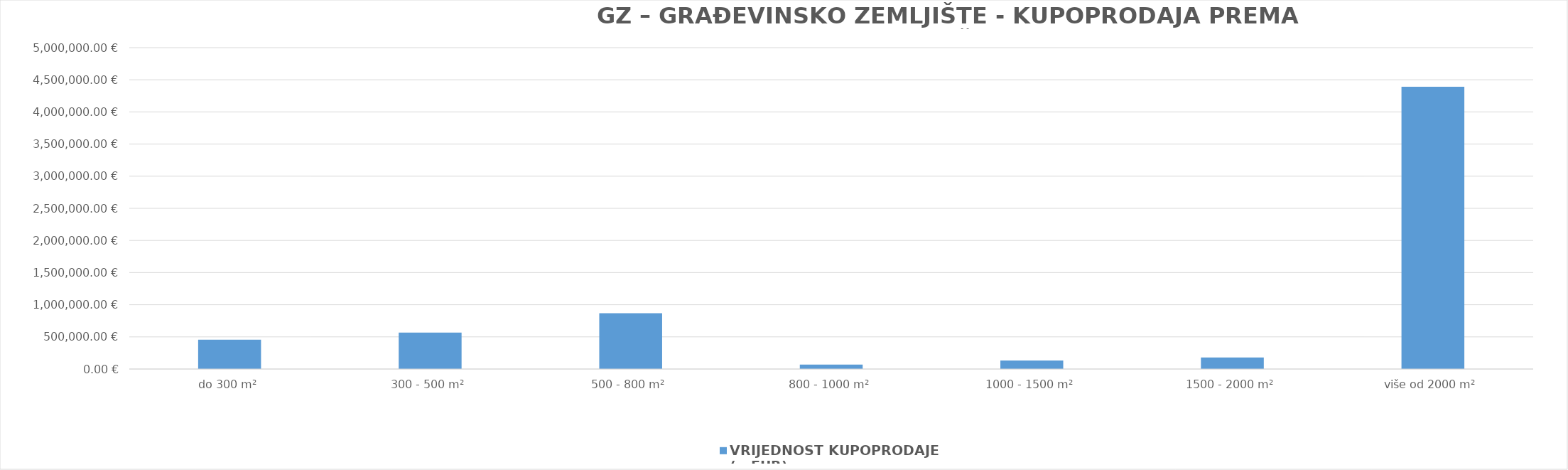
| Category | VRIJEDNOST KUPOPRODAJE (u EUR) |
|---|---|
| do 300 m² | 455066.73 |
| 300 - 500 m² | 567082.642 |
| 500 - 800 m² | 867393.257 |
| 800 - 1000 m² | 69775.542 |
| 1000 - 1500 m² | 132580.578 |
| 1500 - 2000 m² | 179267.529 |
| više od 2000 m² | 4392774.732 |